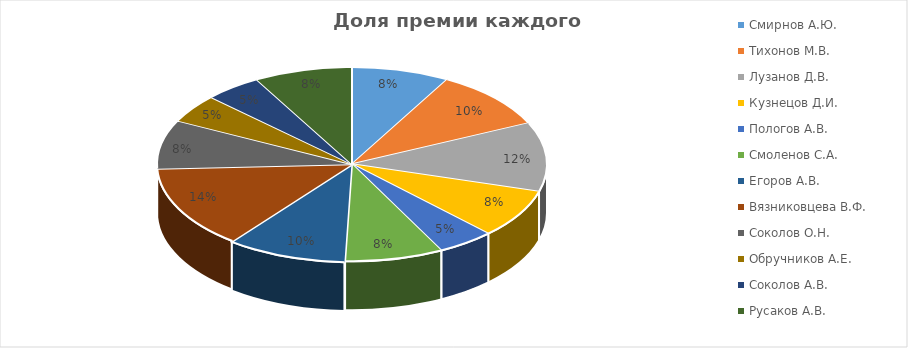
| Category | Series 0 |
|---|---|
| Смирнов А.Ю. | 4500 |
| Тихонов М.В. | 5500 |
| Лузанов Д.В. | 6375 |
| Кузнецов Д.И. | 4500 |
| Пологов А.В. | 2625 |
| Смоленов С.А. | 4500 |
| Егоров А.В. | 5500 |
| Вязниковцева В.Ф. | 7625 |
| Соколов О.Н. | 4500 |
| Обручников А.Е. | 2625 |
| Соколов А.В. | 2625 |
| Русаков А.В. | 4500 |